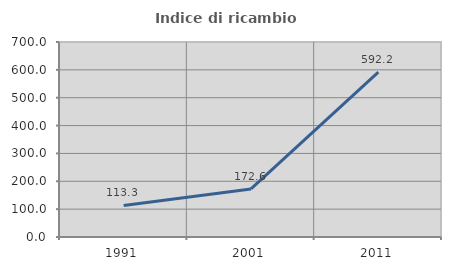
| Category | Indice di ricambio occupazionale  |
|---|---|
| 1991.0 | 113.333 |
| 2001.0 | 172.642 |
| 2011.0 | 592.157 |